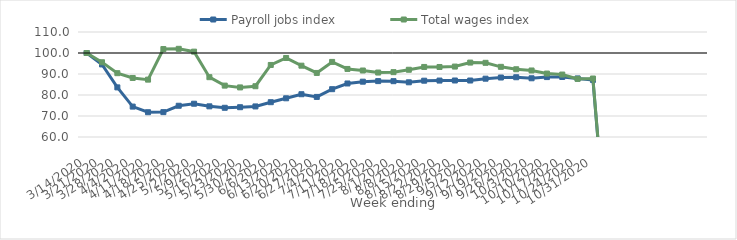
| Category | Payroll jobs index | Total wages index |
|---|---|---|
| 14/03/2020 | 100 | 100 |
| 21/03/2020 | 94.559 | 95.599 |
| 28/03/2020 | 83.624 | 90.388 |
| 04/04/2020 | 74.472 | 88.111 |
| 11/04/2020 | 71.795 | 87.315 |
| 18/04/2020 | 71.845 | 101.881 |
| 25/04/2020 | 74.881 | 101.988 |
| 02/05/2020 | 75.843 | 100.642 |
| 09/05/2020 | 74.604 | 88.485 |
| 16/05/2020 | 73.912 | 84.465 |
| 23/05/2020 | 74.183 | 83.609 |
| 30/05/2020 | 74.555 | 84.175 |
| 06/06/2020 | 76.575 | 94.304 |
| 13/06/2020 | 78.432 | 97.63 |
| 20/06/2020 | 80.371 | 93.96 |
| 27/06/2020 | 79.085 | 90.499 |
| 04/07/2020 | 82.772 | 95.756 |
| 11/07/2020 | 85.488 | 92.41 |
| 18/07/2020 | 86.342 | 91.662 |
| 25/07/2020 | 86.614 | 90.694 |
| 01/08/2020 | 86.582 | 90.883 |
| 08/08/2020 | 86.042 | 92.022 |
| 15/08/2020 | 86.812 | 93.36 |
| 22/08/2020 | 86.871 | 93.336 |
| 29/08/2020 | 86.912 | 93.539 |
| 05/09/2020 | 86.897 | 95.436 |
| 12/09/2020 | 87.769 | 95.32 |
| 19/09/2020 | 88.323 | 93.415 |
| 26/09/2020 | 88.453 | 92.255 |
| 03/10/2020 | 87.965 | 91.677 |
| 10/10/2020 | 88.533 | 90.209 |
| 17/10/2020 | 88.58 | 89.736 |
| 24/10/2020 | 87.891 | 87.665 |
| 31/10/2020 | 87.185 | 87.856 |